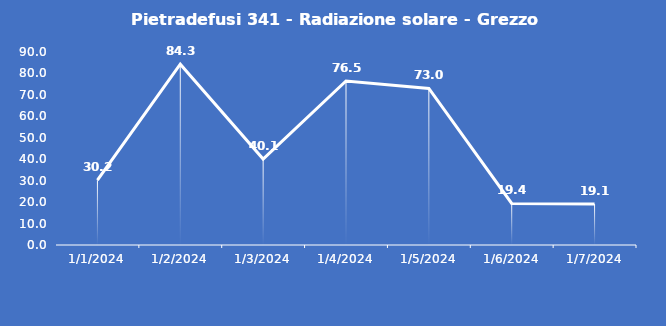
| Category | Pietradefusi 341 - Radiazione solare - Grezzo (W/m2) |
|---|---|
| 1/1/24 | 30.2 |
| 1/2/24 | 84.3 |
| 1/3/24 | 40.1 |
| 1/4/24 | 76.5 |
| 1/5/24 | 73 |
| 1/6/24 | 19.4 |
| 1/7/24 | 19.1 |